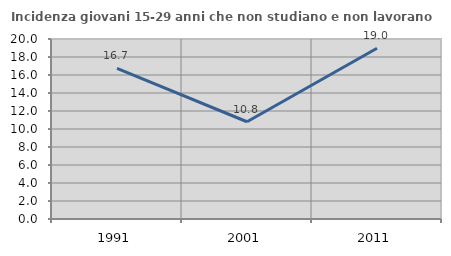
| Category | Incidenza giovani 15-29 anni che non studiano e non lavorano  |
|---|---|
| 1991.0 | 16.735 |
| 2001.0 | 10.806 |
| 2011.0 | 18.978 |